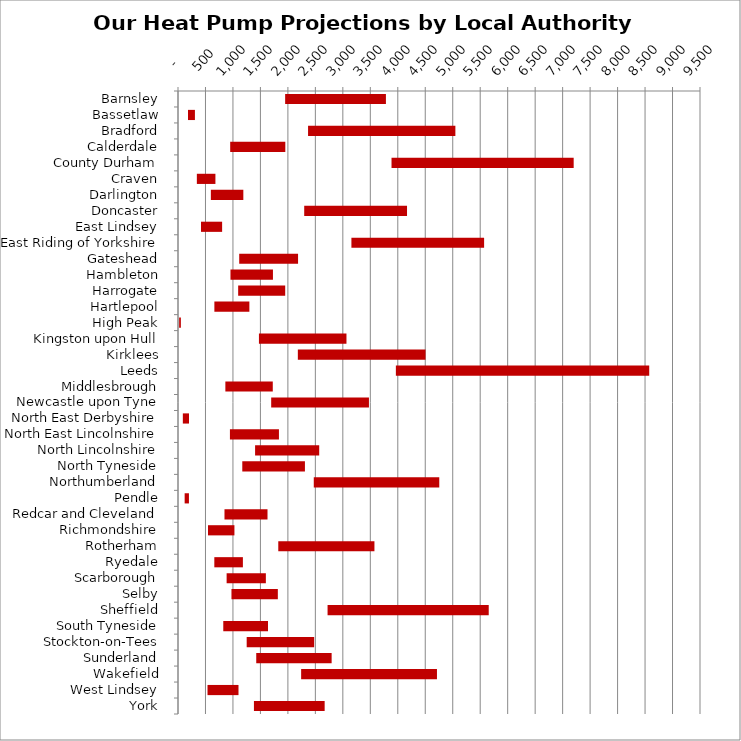
| Category | MIN | MAX |
|---|---|---|
| Barnsley | 1950 | 1834 |
| Bassetlaw | 182 | 126 |
| Bradford | 2367 | 2681 |
| Calderdale | 950 | 1003 |
| County Durham | 3886 | 3315 |
| Craven | 343 | 338 |
| Darlington | 598 | 591 |
| Doncaster | 2297 | 1871 |
| East Lindsey | 419 | 384 |
| East Riding of Yorkshire | 3156 | 2415 |
| Gateshead | 1114 | 1071 |
| Hambleton | 955 | 773 |
| Harrogate | 1095 | 856 |
| Hartlepool | 662 | 637 |
| High Peak | 21 | 31 |
| Kingston upon Hull | 1473 | 1593 |
| Kirklees | 2181 | 2324 |
| Leeds | 3965 | 4611 |
| Middlesbrough | 862 | 863 |
| Newcastle upon Tyne | 1696 | 1779 |
| North East Derbyshire | 88 | 112 |
| North East Lincolnshire | 945 | 892 |
| North Lincolnshire | 1403 | 1167 |
| North Tyneside | 1170 | 1140 |
| Northumberland | 2471 | 2284 |
| Pendle | 121 | 78 |
| Redcar and Cleveland | 846 | 783 |
| Richmondshire | 546 | 481 |
| Rotherham | 1825 | 1750 |
| Ryedale | 661 | 520 |
| Scarborough | 885 | 714 |
| Selby | 973 | 844 |
| Sheffield | 2722 | 2933 |
| South Tyneside | 824 | 814 |
| Stockton-on-Tees | 1250 | 1228 |
| Sunderland | 1424 | 1372 |
| Wakefield | 2241 | 2472 |
| West Lindsey | 537 | 564 |
| York | 1382 | 1287 |